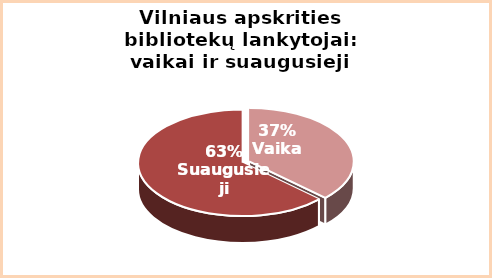
| Category | Series 0 |
|---|---|
| Vaikai | 0.004 |
| Suaugę | 0.006 |